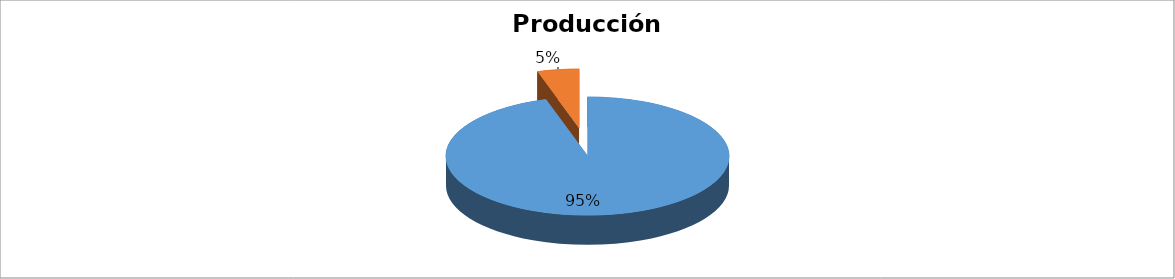
| Category | Series 0 |
|---|---|
| 0 | 0.952 |
| 1 | 0.048 |